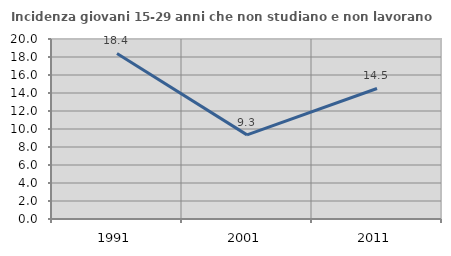
| Category | Incidenza giovani 15-29 anni che non studiano e non lavorano  |
|---|---|
| 1991.0 | 18.396 |
| 2001.0 | 9.349 |
| 2011.0 | 14.501 |